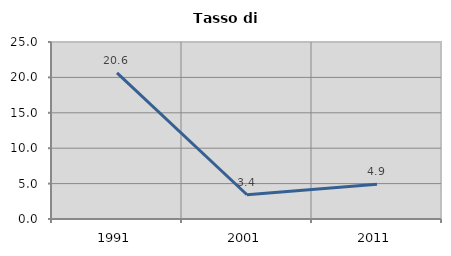
| Category | Tasso di disoccupazione   |
|---|---|
| 1991.0 | 20.635 |
| 2001.0 | 3.421 |
| 2011.0 | 4.91 |